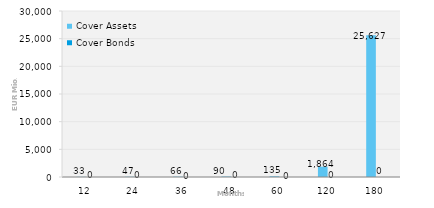
| Category | Cover Assets | Cover Bonds |
|---|---|---|
| 12.0 | 33.184 | 0 |
| 24.0 | 47.46 | 0 |
| 36.0 | 66.085 | 0 |
| 48.0 | 89.748 | 0 |
| 60.0 | 135.363 | 0 |
| 120.0 | 1863.95 | 0 |
| 180.0 | 25627.008 | 0 |